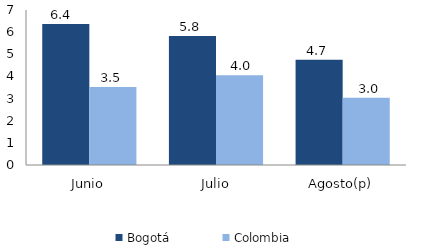
| Category | Bogotá | Colombia |
|---|---|---|
| Junio | 6.372 | 3.527 |
| Julio | 5.823 | 4.05 |
| Agosto(p) | 4.75 | 3.038 |